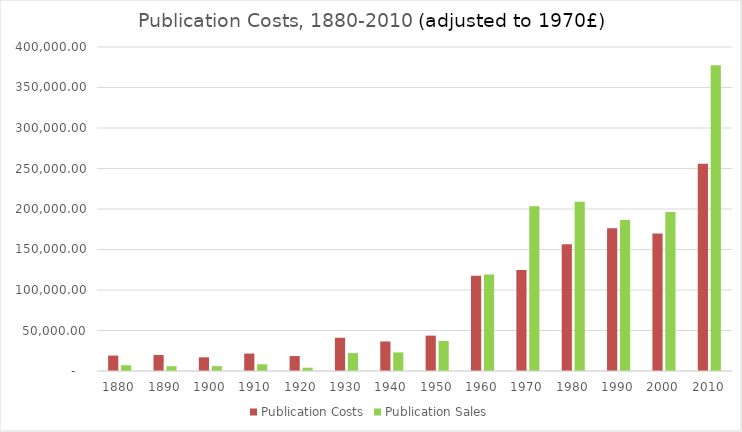
| Category | Publication Costs | Publication Sales |
|---|---|---|
| 1880.0 | 19053.128 | 7090.384 |
| 1890.0 | 19727.339 | 5919.392 |
| 1900.0 | 16923.943 | 5944.424 |
| 1910.0 | 21511.716 | 8286.778 |
| 1920.0 | 18422.628 | 4057.819 |
| 1930.0 | 41073.473 | 22130.668 |
| 1940.0 | 36468.848 | 22978.559 |
| 1950.0 | 43668.869 | 37128.012 |
| 1960.0 | 117573.211 | 119058.829 |
| 1970.0 | 124783 | 203362 |
| 1980.0 | 156484.266 | 209014.944 |
| 1990.0 | 176266.775 | 186304.859 |
| 2000.0 | 169651.696 | 196339.724 |
| 2010.0 | 255736.045 | 377604.897 |